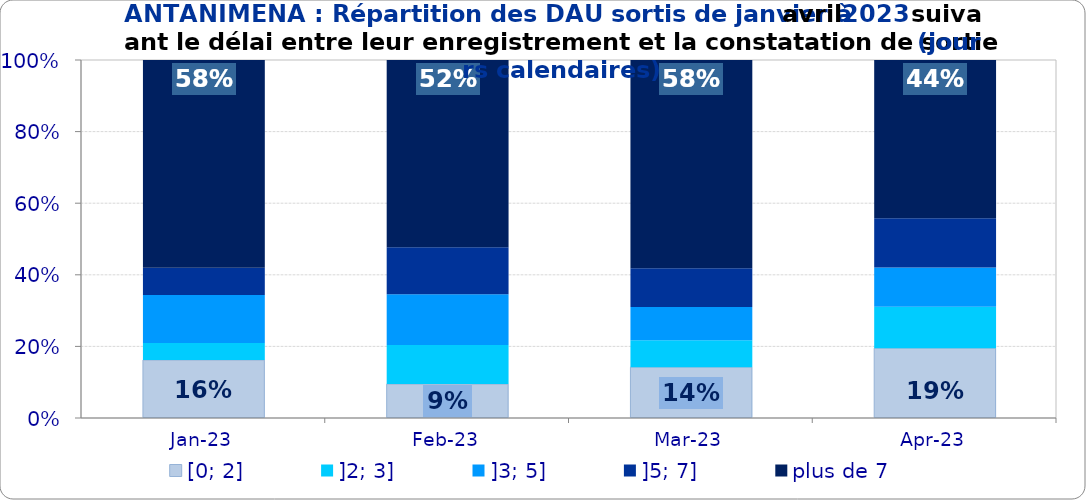
| Category | [0; 2] | ]2; 3] | ]3; 5] | ]5; 7] | plus de 7 |
|---|---|---|---|---|---|
| 2023-01-01 | 0.162 | 0.048 | 0.134 | 0.076 | 0.58 |
| 2023-02-01 | 0.095 | 0.109 | 0.142 | 0.131 | 0.523 |
| 2023-03-01 | 0.142 | 0.075 | 0.093 | 0.109 | 0.581 |
| 2023-04-01 | 0.195 | 0.116 | 0.11 | 0.138 | 0.442 |